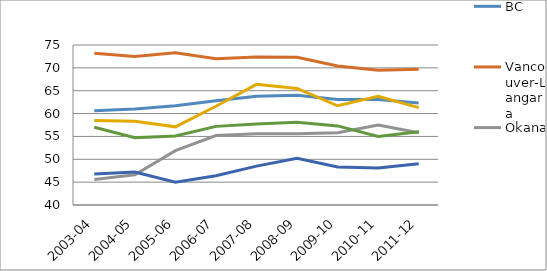
| Category | BC | Vancouver-Langara | Okanagan | Selkirk | Rockies | Thompson Rivers |
|---|---|---|---|---|---|---|
| 2003-04 | 60.6 | 73.2 | 45.6 | 58.5 | 46.8 | 57 |
| 2004-05 | 61 | 72.5 | 46.6 | 58.3 | 47.2 | 54.7 |
| 2005-06 | 61.7 | 73.3 | 51.9 | 57.1 | 45 | 55.1 |
| 2006-07 | 62.8 | 72 | 55.2 | 61.6 | 46.4 | 57.2 |
| 2007-08 | 63.8 | 72.4 | 55.6 | 66.4 | 48.5 | 57.7 |
| 2008-09 | 64 | 72.3 | 55.6 | 65.5 | 50.2 | 58.1 |
| 2009-10 | 63.1 | 70.4 | 55.8 | 61.7 | 48.3 | 57.3 |
| 2010-11 | 63.1 | 69.5 | 57.5 | 63.8 | 48.1 | 55 |
| 2011-12 | 62.3 | 69.7 | 55.8 | 61.3 | 49 | 56 |